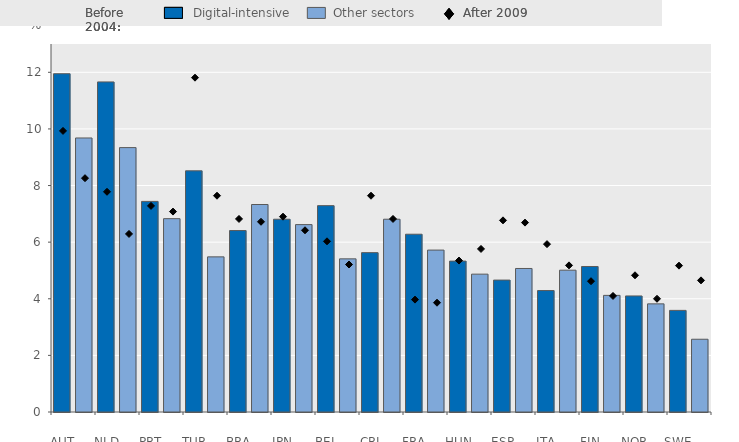
| Category | Before 2004 |
|---|---|
|       AUT | 11.95 |
|  | 9.68 |
|       NLD | 11.66 |
|  | 9.34 |
|       PRT | 7.44 |
|  | 6.83 |
|       TUR | 8.52 |
|  | 5.48 |
|       BRA | 6.41 |
|  | 7.33 |
|       JPN | 6.81 |
|  | 6.62 |
|       BEL | 7.29 |
|  | 5.41 |
|       CRI | 5.63 |
|  | 6.81 |
|       FRA | 6.28 |
|  | 5.72 |
|       HUN | 5.33 |
|  | 4.87 |
|       ESP | 4.66 |
|  | 5.07 |
|       ITA | 4.29 |
|  | 5.01 |
|       FIN | 5.14 |
|  | 4.12 |
|       NOR | 4.1 |
|  | 3.82 |
|       SWE | 3.59 |